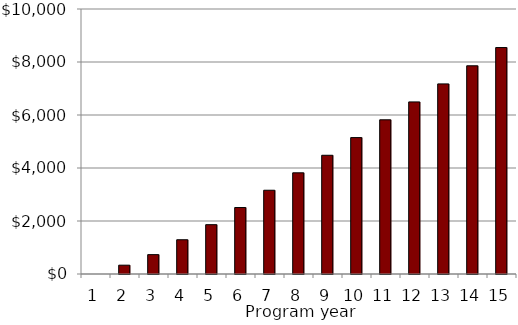
| Category | Series 0 |
|---|---|
| 1.0 | 0 |
| 2.0 | 332.615 |
| 3.0 | 730.821 |
| 4.0 | 1292.84 |
| 5.0 | 1861.285 |
| 6.0 | 2508.019 |
| 7.0 | 3160.417 |
| 8.0 | 3818.056 |
| 9.0 | 4480.464 |
| 10.0 | 5147.338 |
| 11.0 | 5818.501 |
| 12.0 | 6493.859 |
| 13.0 | 7173.386 |
| 14.0 | 7857.106 |
| 15.0 | 8545.077 |